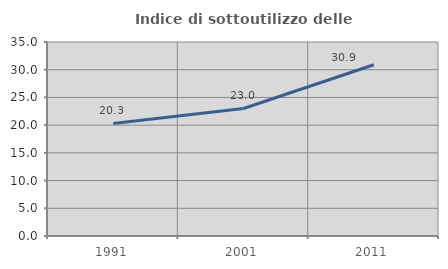
| Category | Indice di sottoutilizzo delle abitazioni  |
|---|---|
| 1991.0 | 20.315 |
| 2001.0 | 23.009 |
| 2011.0 | 30.894 |